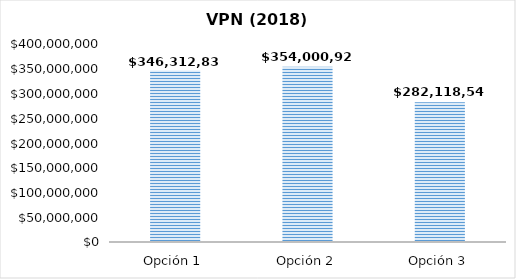
| Category | VPN (2018) [USD] |
|---|---|
| Opción 1 | 346312829.551 |
| Opción 2 | 354000925.891 |
| Opción 3 | 282118546.734 |